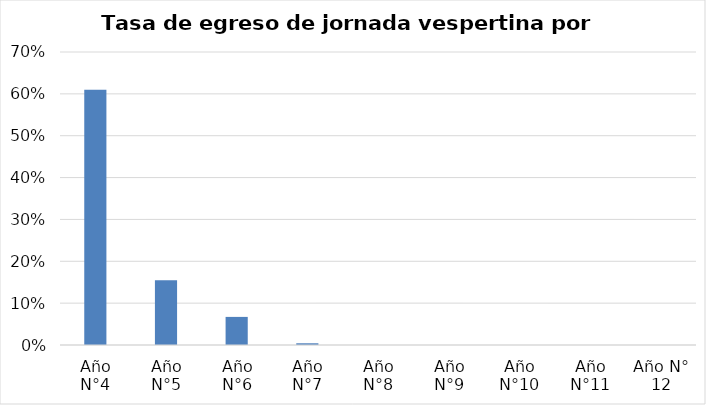
| Category | Series 0 |
|---|---|
| Año N°4 | 0.61 |
| Año N°5 | 0.155 |
| Año N°6 | 0.067 |
| Año N°7 | 0.004 |
| Año N°8 | 0 |
| Año N°9 | 0 |
| Año N°10 | 0 |
| Año N°11 | 0 |
| Año N° 12 | 0 |